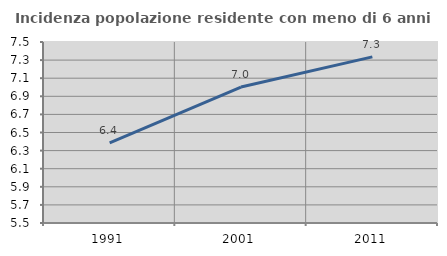
| Category | Incidenza popolazione residente con meno di 6 anni |
|---|---|
| 1991.0 | 6.386 |
| 2001.0 | 7.002 |
| 2011.0 | 7.336 |